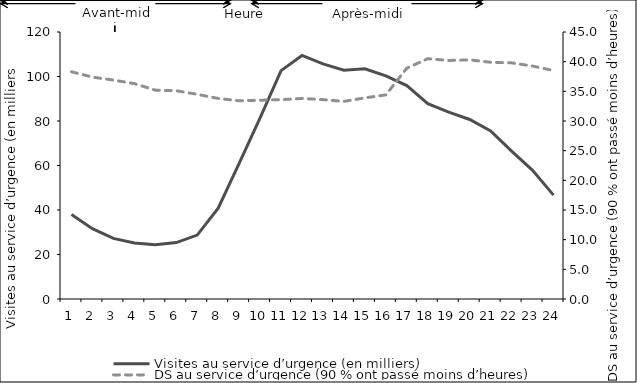
| Category | Visites au service d’urgence (en milliers) |
|---|---|
| 0 | 38.019 |
| 1 | 31.622 |
| 2 | 27.245 |
| 3 | 25.137 |
| 4 | 24.413 |
| 5 | 25.341 |
| 6 | 28.728 |
| 7 | 40.846 |
| 8 | 60.974 |
| 9 | 81.415 |
| 10 | 102.639 |
| 11 | 109.46 |
| 12 | 105.643 |
| 13 | 102.835 |
| 14 | 103.458 |
| 15 | 100.296 |
| 16 | 95.914 |
| 17 | 87.786 |
| 18 | 84.008 |
| 19 | 80.692 |
| 20 | 75.557 |
| 21 | 66.449 |
| 22 | 57.827 |
| 23 | 46.699 |